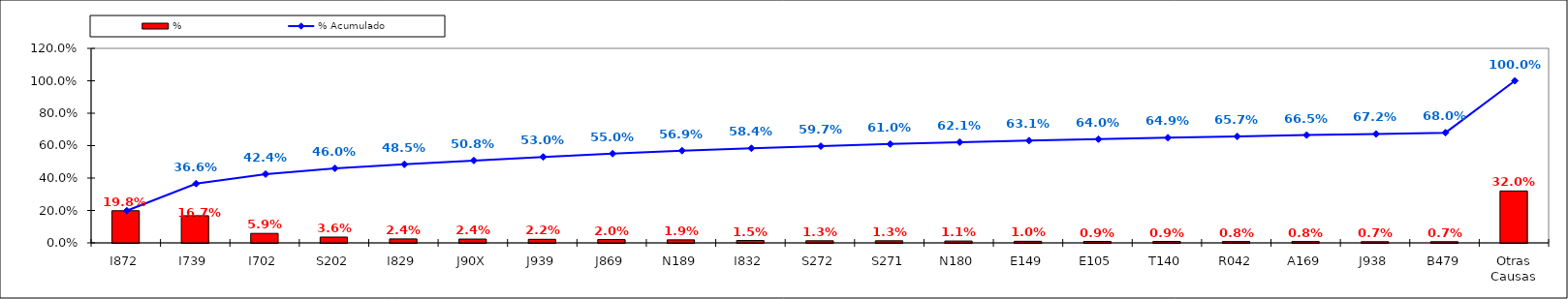
| Category | % |
|---|---|
| I872 | 0.198 |
| I739 | 0.167 |
| I702 | 0.059 |
| S202 | 0.036 |
| I829 | 0.024 |
| J90X | 0.024 |
| J939 | 0.022 |
| J869 | 0.02 |
| N189 | 0.019 |
| I832 | 0.015 |
| S272 | 0.013 |
| S271 | 0.013 |
| N180 | 0.011 |
| E149 | 0.01 |
| E105 | 0.009 |
| T140 | 0.009 |
| R042 | 0.008 |
| A169 | 0.008 |
| J938 | 0.007 |
| B479 | 0.007 |
| Otras Causas | 0.32 |